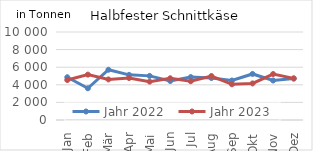
| Category | Jahr 2022 | Jahr 2023 |
|---|---|---|
| Jan | 4859.572 | 4540.347 |
| Feb | 3603.803 | 5157.125 |
| Mär | 5711.005 | 4609.98 |
| Apr | 5129.989 | 4772.942 |
| Mai | 5014.839 | 4362.493 |
| Jun | 4432.599 | 4741.428 |
| Jul | 4877.658 | 4408.566 |
| Aug | 4769.335 | 4999.224 |
| Sep | 4487.63 | 4060.504 |
| Okt | 5233.099 | 4156.958 |
| Nov | 4488.34 | 5222.984 |
| Dez | 4705.399 | 4733.279 |